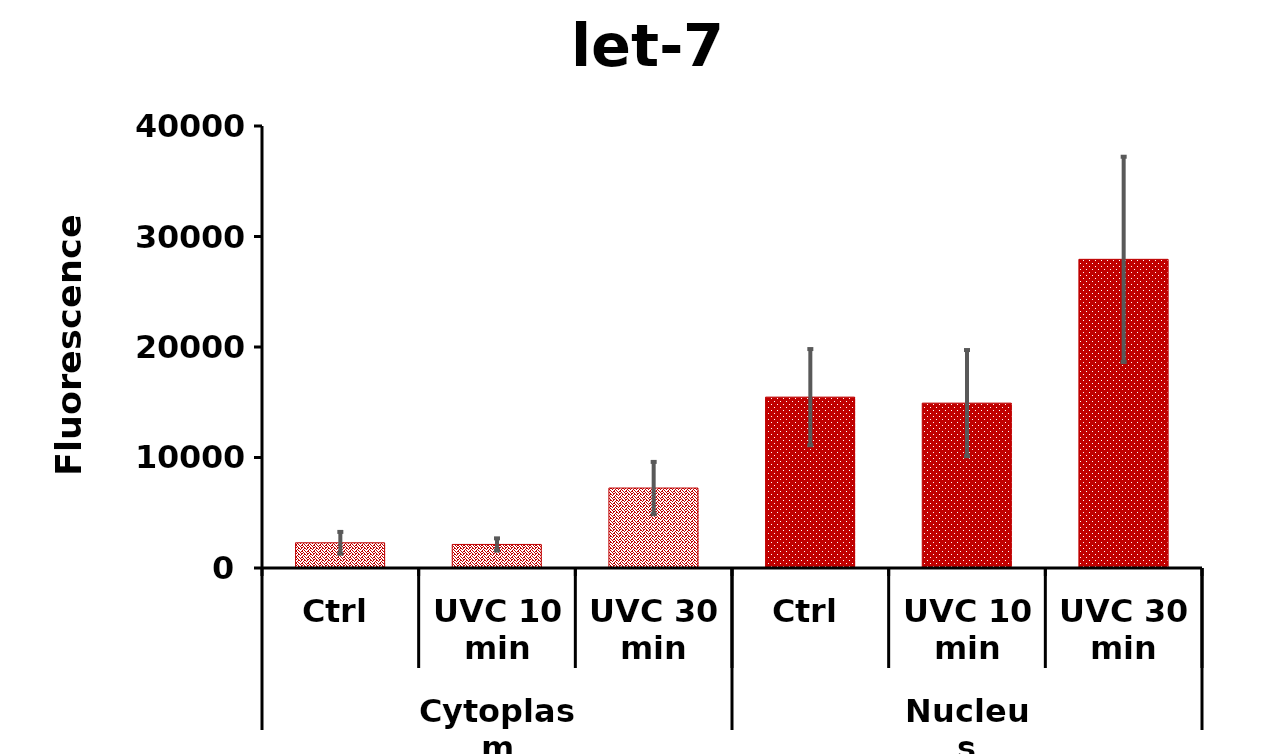
| Category | Series 0 |
|---|---|
| 0 | 2280.2 |
| 1 | 2131.578 |
| 2 | 7235.8 |
| 3 | 15463.4 |
| 4 | 14920.644 |
| 5 | 27933.6 |